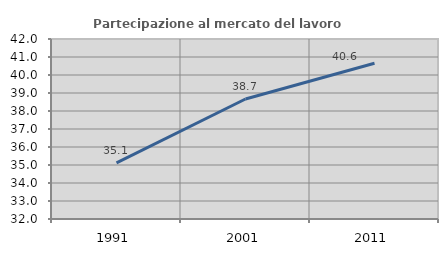
| Category | Partecipazione al mercato del lavoro  femminile |
|---|---|
| 1991.0 | 35.114 |
| 2001.0 | 38.667 |
| 2011.0 | 40.65 |